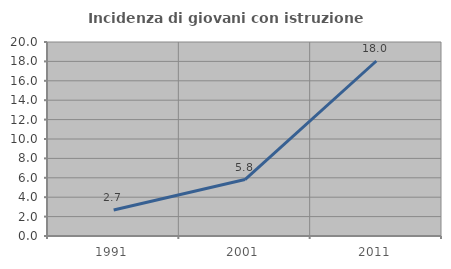
| Category | Incidenza di giovani con istruzione universitaria |
|---|---|
| 1991.0 | 2.682 |
| 2001.0 | 5.818 |
| 2011.0 | 18.041 |